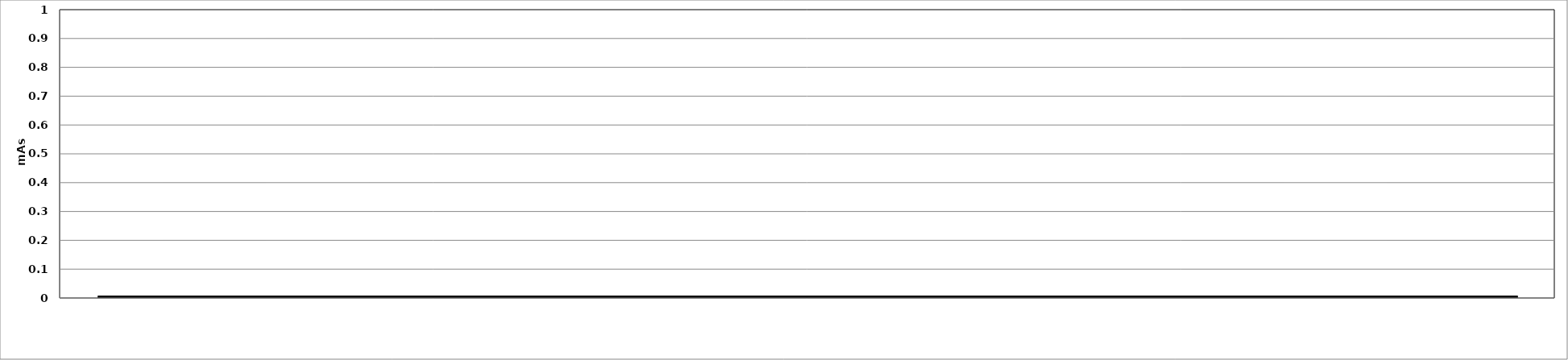
| Category | Series 0 | Series 1 | Series 2 |
|---|---|---|---|
|  |  | 0 | 0 |
|  |  | 0 | 0 |
|  |  | 0 | 0 |
|  |  | 0 | 0 |
|  |  | 0 | 0 |
|  |  | 0 | 0 |
|  |  | 0 | 0 |
|  |  | 0 | 0 |
|  |  | 0 | 0 |
|  |  | 0 | 0 |
|  |  | 0 | 0 |
|  |  | 0 | 0 |
|  |  | 0 | 0 |
|  |  | 0 | 0 |
|  |  | 0 | 0 |
|  |  | 0 | 0 |
|  |  | 0 | 0 |
|  |  | 0 | 0 |
|  |  | 0 | 0 |